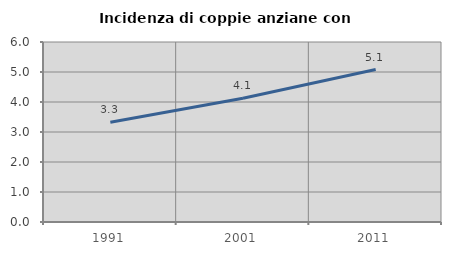
| Category | Incidenza di coppie anziane con figli |
|---|---|
| 1991.0 | 3.328 |
| 2001.0 | 4.125 |
| 2011.0 | 5.081 |